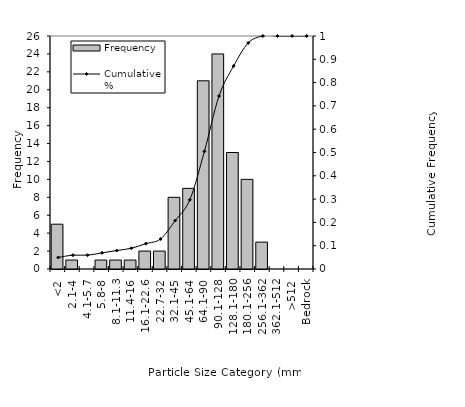
| Category | Frequency |
|---|---|
| <2 | 5 |
| 2.1-4 | 1 |
| 4.1-5.7 | 0 |
| 5.8-8 | 1 |
| 8.1-11.3 | 1 |
| 11.4-16 | 1 |
| 16.1-22.6 | 2 |
| 22.7-32 | 2 |
| 32.1-45 | 8 |
| 45.1-64 | 9 |
| 64.1-90 | 21 |
| 90.1-128 | 24 |
| 128.1-180 | 13 |
| 180.1-256 | 10 |
| 256.1-362 | 3 |
| 362.1-512 | 0 |
| >512 | 0 |
| Bedrock | 0 |